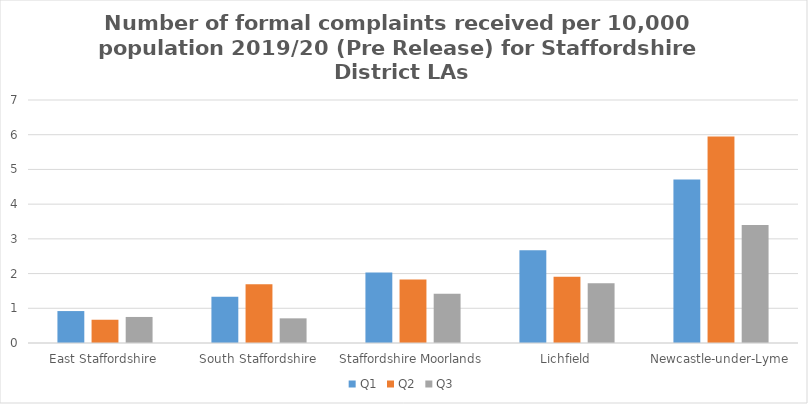
| Category | Q1 | Q2 | Q3 |
|---|---|---|---|
| East Staffordshire | 0.92 | 0.67 | 0.75 |
| South Staffordshire | 1.33 | 1.69 | 0.71 |
| Staffordshire Moorlands | 2.03 | 1.83 | 1.42 |
| Lichfield | 2.67 | 1.91 | 1.72 |
| Newcastle-under-Lyme | 4.71 | 5.95 | 3.4 |